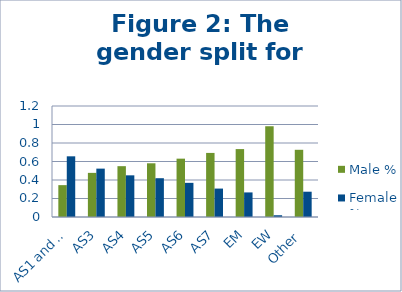
| Category | Male % | Female % |
|---|---|---|
| AS1 and AS22 | 0.344 | 0.656 |
| AS3 | 0.477 | 0.523 |
| AS4 | 0.55 | 0.45 |
| AS5 | 0.581 | 0.419 |
| AS6 | 0.631 | 0.369 |
| AS7 | 0.693 | 0.307 |
| EM | 0.734 | 0.266 |
| EW | 0.981 | 0.019 |
| Other | 0.727 | 0.273 |